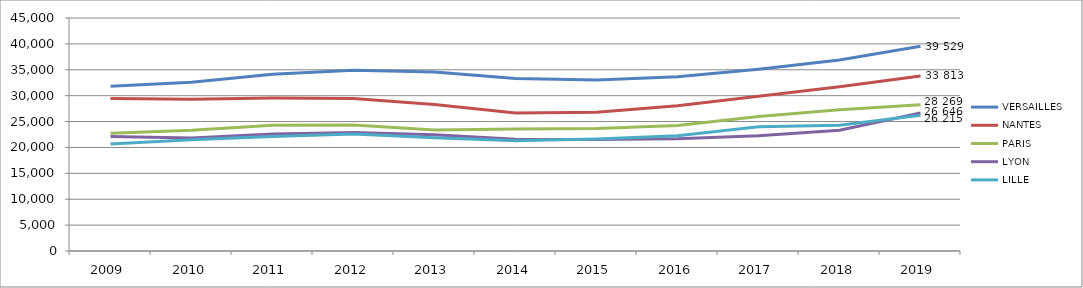
| Category | VERSAILLES | NANTES | PARIS | LYON | LILLE |
|---|---|---|---|---|---|
| 2009.0 | 31823 | 29441 | 22765 | 22100 | 20668 |
| 2010.0 | 32576 | 29319 | 23342 | 21838 | 21488 |
| 2011.0 | 34123 | 29543 | 24282 | 22594 | 22126 |
| 2012.0 | 34905 | 29435 | 24351 | 22908 | 22589 |
| 2013.0 | 34553 | 28286 | 23391 | 22436 | 21871 |
| 2014.0 | 33299 | 26670 | 23566 | 21593 | 21289 |
| 2015.0 | 33004 | 26800 | 23659 | 21522 | 21627 |
| 2016.0 | 33632 | 28075 | 24228 | 21665 | 22241 |
| 2017.0 | 35086 | 29893 | 25956 | 22265 | 24012 |
| 2018.0 | 36875 | 31743 | 27267 | 23304 | 24307 |
| 2019.0 | 39529 | 33813 | 28269 | 26646 | 26215 |